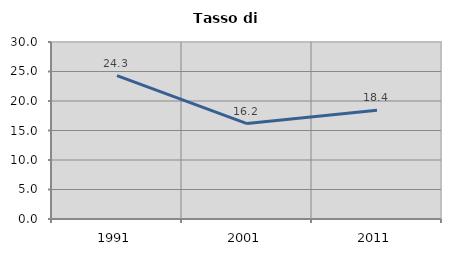
| Category | Tasso di disoccupazione   |
|---|---|
| 1991.0 | 24.304 |
| 2001.0 | 16.179 |
| 2011.0 | 18.416 |